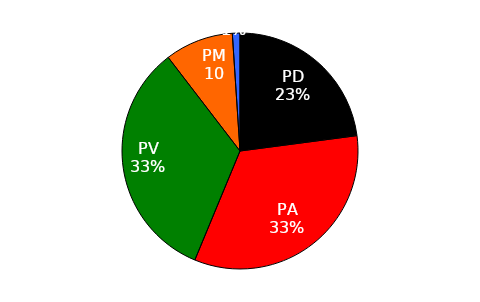
| Category | Series 0 |
|---|---|
| PD | 22.917 |
| PA | 33.333 |
| PV | 33.333 |
| PM | 9.375 |
| PB | 1.042 |